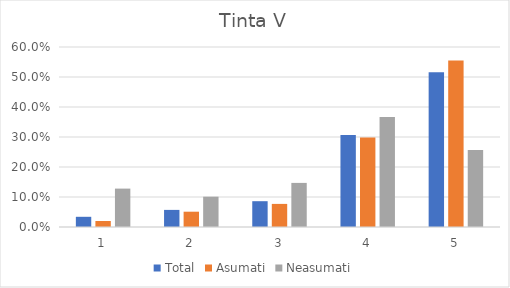
| Category | Total | Asumati | Neasumati |
|---|---|---|---|
| 0 | 0.034 | 0.02 | 0.128 |
| 1 | 0.057 | 0.051 | 0.101 |
| 2 | 0.086 | 0.077 | 0.147 |
| 3 | 0.307 | 0.298 | 0.367 |
| 4 | 0.516 | 0.555 | 0.257 |